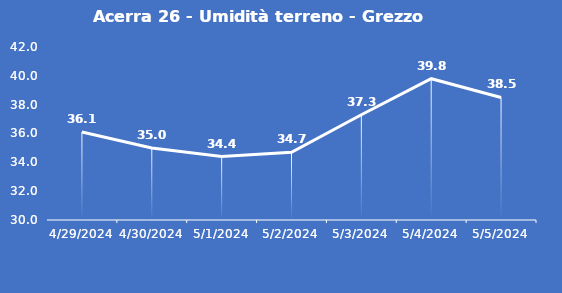
| Category | Acerra 26 - Umidità terreno - Grezzo (%VWC) |
|---|---|
| 4/29/24 | 36.1 |
| 4/30/24 | 35 |
| 5/1/24 | 34.4 |
| 5/2/24 | 34.7 |
| 5/3/24 | 37.3 |
| 5/4/24 | 39.8 |
| 5/5/24 | 38.5 |